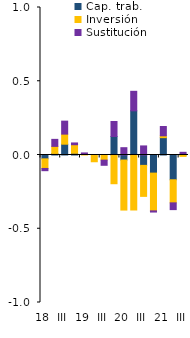
| Category | Cap. trab. | Inversión | Sustitución |
|---|---|---|---|
| 18 | -0.026 | -0.065 | -0.015 |
| II | 0.011 | 0.048 | 0.048 |
| III | 0.073 | 0.068 | 0.088 |
| IV | 0.012 | 0.058 | 0.012 |
| 19 | 0 | 0.007 | 0.007 |
| II | 0 | -0.046 | 0 |
| III | 0 | -0.035 | -0.035 |
| IV | 0.126 | -0.195 | 0.102 |
| 20 | -0.034 | -0.339 | 0.05 |
| II | 0.299 | -0.373 | 0.132 |
| III | -0.07 | -0.21 | 0.062 |
| IV | -0.123 | -0.256 | -0.008 |
| 21 | 0.118 | 0.012 | 0.063 |
| II | -0.168 | -0.156 | -0.046 |
| III | 0.005 | -0.009 | 0.014 |